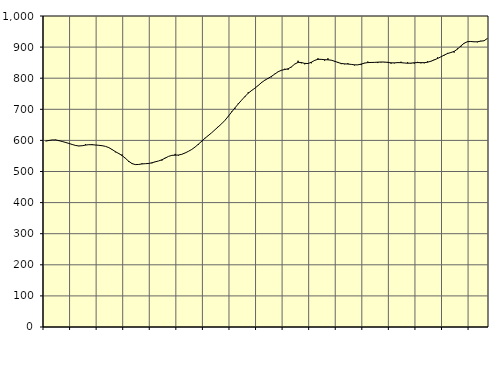
| Category | Piggar | Series 1 |
|---|---|---|
| nan | 598.3 | 597.73 |
| 87.0 | 599.3 | 599.8 |
| 87.0 | 601.6 | 601.44 |
| 87.0 | 602.3 | 601.44 |
| nan | 597.8 | 599.35 |
| 88.0 | 597.2 | 596.42 |
| 88.0 | 592.2 | 593.41 |
| 88.0 | 589.8 | 590.28 |
| nan | 586.1 | 586.9 |
| 89.0 | 583.1 | 583.73 |
| 89.0 | 581.6 | 582.11 |
| 89.0 | 582.5 | 582.89 |
| nan | 587.6 | 584.95 |
| 90.0 | 586.4 | 586.24 |
| 90.0 | 588 | 586.08 |
| 90.0 | 584.8 | 585.22 |
| nan | 584.7 | 584.22 |
| 91.0 | 583.3 | 582.96 |
| 91.0 | 580.8 | 580.83 |
| 91.0 | 576.3 | 576.88 |
| nan | 569.7 | 570.65 |
| 92.0 | 561.8 | 563.82 |
| 92.0 | 556.4 | 557.83 |
| 92.0 | 554.6 | 551.25 |
| nan | 543.5 | 542.61 |
| 93.0 | 530.5 | 532.94 |
| 93.0 | 526.5 | 525.47 |
| 93.0 | 521.6 | 522.25 |
| nan | 523.3 | 522.67 |
| 94.0 | 526.2 | 524.27 |
| 94.0 | 524.9 | 525.11 |
| 94.0 | 524.2 | 525.85 |
| nan | 526.4 | 528.05 |
| 95.0 | 532 | 531.08 |
| 95.0 | 533.9 | 533.89 |
| 95.0 | 535 | 537.7 |
| nan | 544.2 | 543.05 |
| 96.0 | 548.7 | 548.61 |
| 96.0 | 551.6 | 551.94 |
| 96.0 | 556.6 | 552.55 |
| nan | 551.3 | 552.97 |
| 97.0 | 555.7 | 555.3 |
| 97.0 | 559.3 | 559.68 |
| 97.0 | 565.2 | 564.92 |
| nan | 570.7 | 570.93 |
| 98.0 | 578.9 | 578.72 |
| 98.0 | 585.7 | 587.91 |
| 98.0 | 595.9 | 597.51 |
| nan | 608.1 | 607.21 |
| 99.0 | 614.5 | 615.82 |
| 99.0 | 624.8 | 624.74 |
| 99.0 | 634.4 | 634.42 |
| nan | 645.5 | 644.03 |
| 0.0 | 653.7 | 653.53 |
| 0.0 | 664.4 | 664.64 |
| 0.0 | 678.5 | 677.67 |
| nan | 692.6 | 691.25 |
| 1.0 | 701.7 | 704.56 |
| 1.0 | 719 | 717.16 |
| 1.0 | 729.4 | 729.34 |
| nan | 739.3 | 741.11 |
| 2.0 | 754.9 | 751.66 |
| 2.0 | 759.1 | 760.25 |
| 2.0 | 767.5 | 767.85 |
| nan | 775.8 | 776.56 |
| 3.0 | 787.8 | 785.9 |
| 3.0 | 794.4 | 793.52 |
| 3.0 | 798.3 | 799.54 |
| nan | 803.2 | 805.87 |
| 4.0 | 814.2 | 813.28 |
| 4.0 | 821.4 | 820.7 |
| 4.0 | 826.4 | 825.61 |
| nan | 830.4 | 827.93 |
| 5.0 | 827.1 | 830.23 |
| 5.0 | 835.4 | 836.47 |
| 5.0 | 845.8 | 845.36 |
| nan | 856.2 | 850.79 |
| 6.0 | 847.8 | 850.47 |
| 6.0 | 844.7 | 847.64 |
| 6.0 | 847.8 | 847.23 |
| nan | 847.9 | 851.25 |
| 7.0 | 858.4 | 857.22 |
| 7.0 | 864 | 860.79 |
| 7.0 | 859.5 | 860.62 |
| nan | 856.5 | 859.51 |
| 8.0 | 864 | 859.17 |
| 8.0 | 858.4 | 857.94 |
| 8.0 | 853.3 | 854.61 |
| nan | 852.3 | 850.62 |
| 9.0 | 845.2 | 847.44 |
| 9.0 | 844.9 | 846.14 |
| 9.0 | 848.2 | 845.55 |
| nan | 844.4 | 844.45 |
| 10.0 | 841.2 | 842.96 |
| 10.0 | 843.2 | 842.88 |
| 10.0 | 842.2 | 845.38 |
| nan | 849.2 | 848.45 |
| 11.0 | 853.5 | 850.21 |
| 11.0 | 849.5 | 850.63 |
| 11.0 | 851.4 | 850.84 |
| nan | 848.7 | 851.53 |
| 12.0 | 850.9 | 852.08 |
| 12.0 | 851.1 | 851.96 |
| 12.0 | 852.3 | 850.78 |
| nan | 846.9 | 849.38 |
| 13.0 | 847.9 | 849.31 |
| 13.0 | 851.7 | 850.09 |
| 13.0 | 853 | 849.99 |
| nan | 849.1 | 848.91 |
| 14.0 | 851.4 | 848.03 |
| 14.0 | 847.3 | 848.47 |
| 14.0 | 847 | 849.72 |
| nan | 852.5 | 850.26 |
| 15.0 | 847.9 | 850.01 |
| 15.0 | 848 | 849.89 |
| 15.0 | 854.1 | 851.39 |
| nan | 853.8 | 854.55 |
| 16.0 | 860 | 858.68 |
| 16.0 | 866.8 | 863.34 |
| 16.0 | 868.9 | 868.52 |
| nan | 873 | 874.39 |
| 17.0 | 881.3 | 879.26 |
| 17.0 | 883.2 | 882.51 |
| 17.0 | 882.4 | 886.17 |
| nan | 895.7 | 893.48 |
| 18.0 | 900.6 | 903.47 |
| 18.0 | 911.3 | 912.3 |
| 18.0 | 916.3 | 917.31 |
| nan | 917.5 | 918.08 |
| 19.0 | 917.5 | 917 |
| 19.0 | 915.5 | 917.1 |
| 19.0 | 920.2 | 919.1 |
| nan | 920.1 | 920.33 |
| 20.0 | 927 | 927.62 |